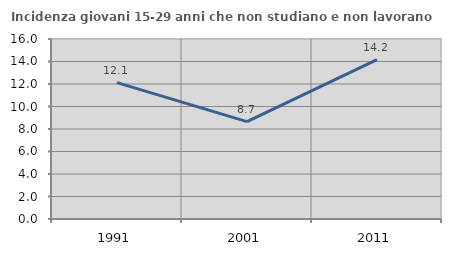
| Category | Incidenza giovani 15-29 anni che non studiano e non lavorano  |
|---|---|
| 1991.0 | 12.124 |
| 2001.0 | 8.653 |
| 2011.0 | 14.16 |